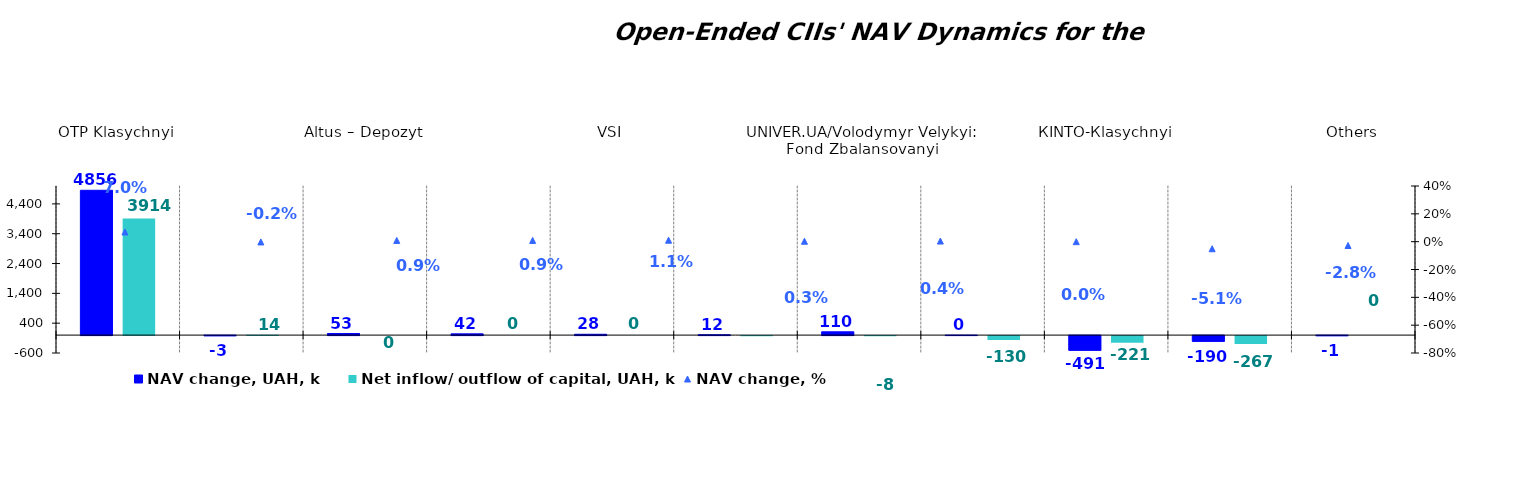
| Category | NAV change, UAH, k | Net inflow/ outflow of capital, UAH, k |
|---|---|---|
| ОТP Klasychnyi | 4856.034 | 3914.344 |
| КІNTO-Ekviti | -3 | 14.457 |
| Altus – Depozyt | 52.725 | 0 |
| Altus Zbalansovanyi | 41.564 | 0 |
| VSI | 27.595 | 0 |
| Nadbannia | 12.257 | -4.003 |
| UNIVER.UA/Volodymyr Velykyi: Fond Zbalansovanyi | 110.293 | -7.775 |
| KINTO-Kaznacheiskyi | 0.345 | -129.528 |
| КІNТО-Кlasychnyi | -491.32 | -220.797 |
| UNIVER.UA/Мykhailo Hrushevskyi: Fond Derzhavnykh Paperiv | -190.37 | -267.194 |
| Others | -0.756 | 0 |